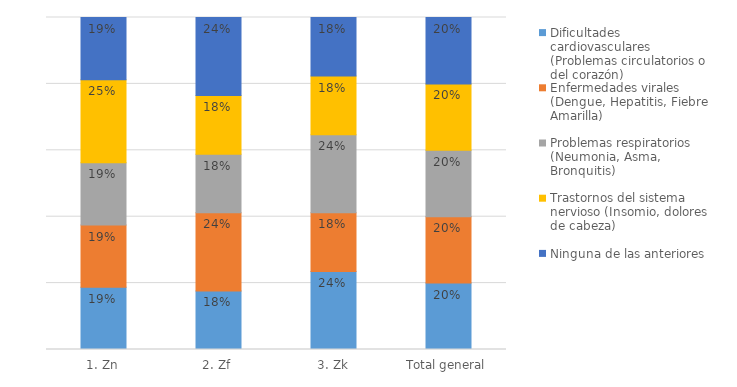
| Category | Dificultades cardiovasculares (Problemas circulatorios o del corazón) | Enfermedades virales (Dengue, Hepatitis, Fiebre Amarilla) | Problemas respiratorios (Neumonia, Asma, Bronquitis) | Trastornos del sistema nervioso (Insomio, dolores de cabeza) | Ninguna de las anteriores |
|---|---|---|---|---|---|
| 1. Zn | 0.188 | 0.188 | 0.188 | 0.25 | 0.188 |
| 2. Zf | 0.176 | 0.235 | 0.176 | 0.176 | 0.235 |
| 3. Zk | 0.235 | 0.176 | 0.235 | 0.176 | 0.176 |
| Total general | 0.2 | 0.2 | 0.2 | 0.2 | 0.2 |